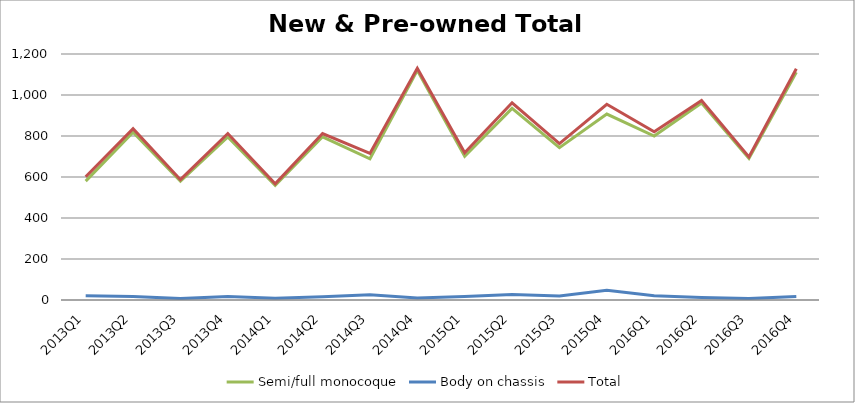
| Category | Semi/full monocoque | Body on chassis | Total |
|---|---|---|---|
| 2013Q1 | 580 | 21 | 601 |
| 2013Q2 | 819 | 17 | 836 |
| 2013Q3 | 580 | 7 | 587 |
| 2013Q4 | 795 | 17 | 812 |
| 2014Q1 | 559 | 8 | 567 |
| 2014Q2 | 796 | 16 | 812 |
| 2014Q3 | 689 | 26 | 715 |
| 2014Q4 | 1120 | 10 | 1130 |
| 2015Q1 | 701 | 17 | 718 |
| 2015Q2 | 935 | 27 | 962 |
| 2015Q3 | 743 | 20 | 763 |
| 2015Q4 | 907 | 48 | 955 |
| 2016Q1 | 800 | 21 | 821 |
| 2016Q2 | 961 | 12 | 973 |
| 2016Q3 | 691 | 7 | 698 |
| 2016Q4 | 1111 | 17 | 1128 |